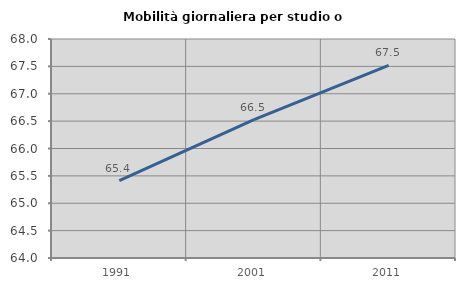
| Category | Mobilità giornaliera per studio o lavoro |
|---|---|
| 1991.0 | 65.413 |
| 2001.0 | 66.527 |
| 2011.0 | 67.52 |